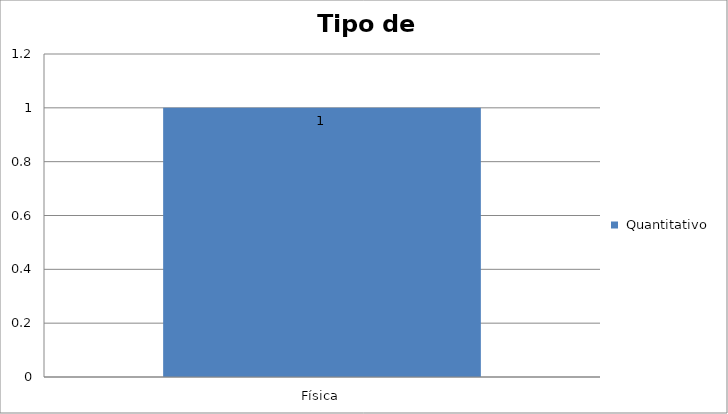
| Category |  Quantitativo |
|---|---|
| Física | 1 |